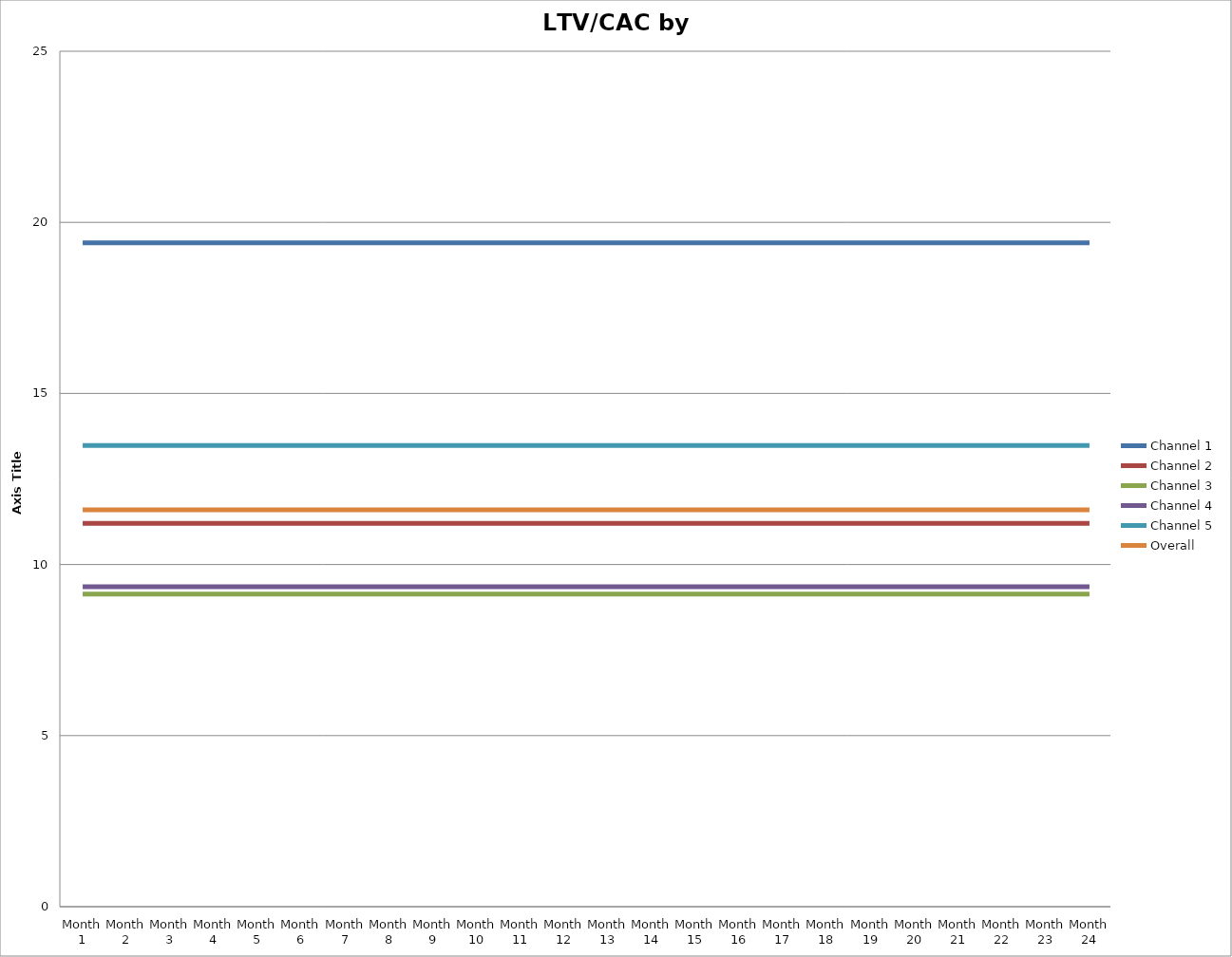
| Category | Channel 1 | Channel 2 | Channel 3 | Channel 4 | Channel 5 | Overall |
|---|---|---|---|---|---|---|
| Month 1 | 19.4 | 11.2 | 9.133 | 9.35 | 13.48 | 11.6 |
| Month 2 | 19.4 | 11.2 | 9.133 | 9.35 | 13.48 | 11.6 |
| Month 3 | 19.4 | 11.2 | 9.133 | 9.35 | 13.48 | 11.6 |
| Month 4 | 19.4 | 11.2 | 9.133 | 9.35 | 13.48 | 11.6 |
| Month 5 | 19.4 | 11.2 | 9.133 | 9.35 | 13.48 | 11.6 |
| Month 6 | 19.4 | 11.2 | 9.133 | 9.35 | 13.48 | 11.6 |
| Month 7 | 19.4 | 11.2 | 9.133 | 9.35 | 13.48 | 11.6 |
| Month 8 | 19.4 | 11.2 | 9.133 | 9.35 | 13.48 | 11.6 |
| Month 9 | 19.4 | 11.2 | 9.133 | 9.35 | 13.48 | 11.6 |
| Month 10 | 19.4 | 11.2 | 9.133 | 9.35 | 13.48 | 11.6 |
| Month 11 | 19.4 | 11.2 | 9.133 | 9.35 | 13.48 | 11.6 |
| Month 12 | 19.4 | 11.2 | 9.133 | 9.35 | 13.48 | 11.6 |
| Month 13 | 19.4 | 11.2 | 9.133 | 9.35 | 13.48 | 11.6 |
| Month 14 | 19.4 | 11.2 | 9.133 | 9.35 | 13.48 | 11.6 |
| Month 15 | 19.4 | 11.2 | 9.133 | 9.35 | 13.48 | 11.6 |
| Month 16 | 19.4 | 11.2 | 9.133 | 9.35 | 13.48 | 11.6 |
| Month 17 | 19.4 | 11.2 | 9.133 | 9.35 | 13.48 | 11.6 |
| Month 18 | 19.4 | 11.2 | 9.133 | 9.35 | 13.48 | 11.6 |
| Month 19 | 19.4 | 11.2 | 9.133 | 9.35 | 13.48 | 11.6 |
| Month 20 | 19.4 | 11.2 | 9.133 | 9.35 | 13.48 | 11.6 |
| Month 21 | 19.4 | 11.2 | 9.133 | 9.35 | 13.48 | 11.6 |
| Month 22 | 19.4 | 11.2 | 9.133 | 9.35 | 13.48 | 11.6 |
| Month 23 | 19.4 | 11.2 | 9.133 | 9.35 | 13.48 | 11.6 |
| Month 24 | 19.4 | 11.2 | 9.133 | 9.35 | 13.48 | 11.6 |